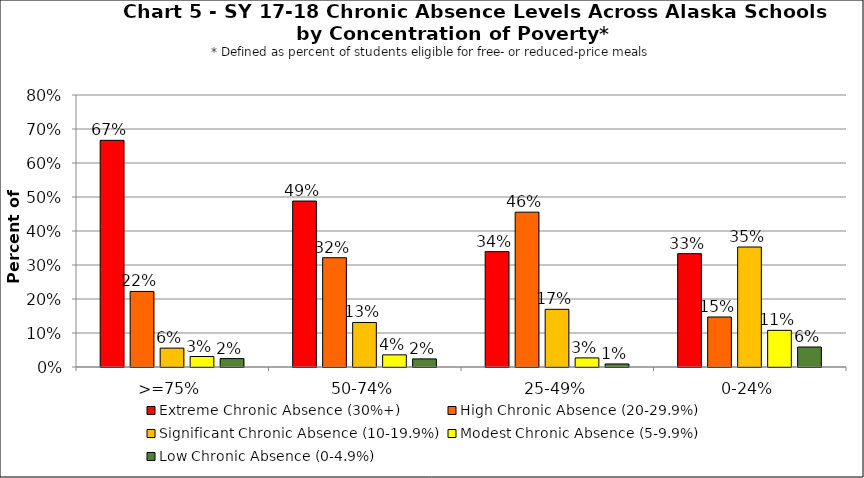
| Category | Extreme Chronic Absence (30%+) | High Chronic Absence (20-29.9%) | Significant Chronic Absence (10-19.9%) | Modest Chronic Absence (5-9.9%) | Low Chronic Absence (0-4.9%) |
|---|---|---|---|---|---|
| 0 | 0.667 | 0.222 | 0.056 | 0.031 | 0.025 |
| 1 | 0.488 | 0.321 | 0.131 | 0.036 | 0.024 |
| 2 | 0.339 | 0.455 | 0.17 | 0.027 | 0.009 |
| 3 | 0.333 | 0.147 | 0.353 | 0.108 | 0.059 |